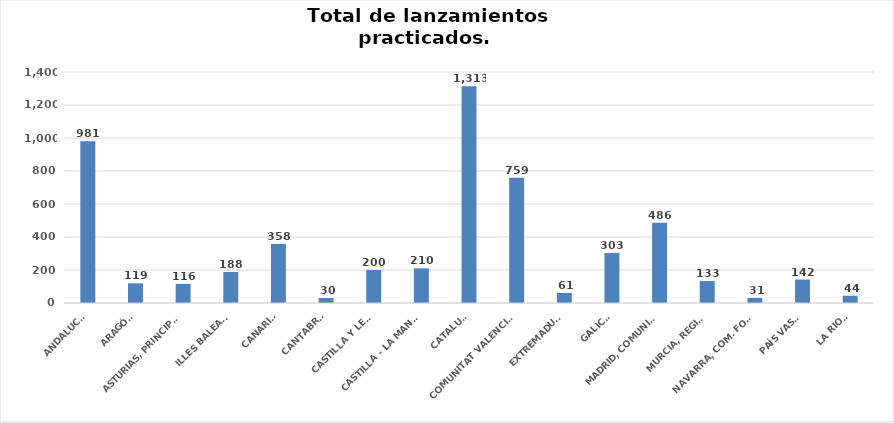
| Category | Series 0 |
|---|---|
| ANDALUCÍA | 981 |
| ARAGÓN | 119 |
| ASTURIAS, PRINCIPADO | 116 |
| ILLES BALEARS | 188 |
| CANARIAS | 358 |
| CANTABRIA | 30 |
| CASTILLA Y LEÓN | 200 |
| CASTILLA - LA MANCHA | 210 |
| CATALUÑA | 1313 |
| COMUNITAT VALENCIANA | 759 |
| EXTREMADURA | 61 |
| GALICIA | 303 |
| MADRID, COMUNIDAD | 486 |
| MURCIA, REGIÓN | 133 |
| NAVARRA, COM. FORAL | 31 |
| PAÍS VASCO | 142 |
| LA RIOJA | 44 |